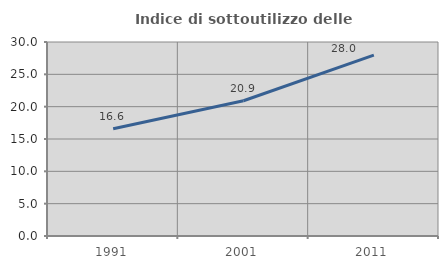
| Category | Indice di sottoutilizzo delle abitazioni  |
|---|---|
| 1991.0 | 16.595 |
| 2001.0 | 20.912 |
| 2011.0 | 27.974 |